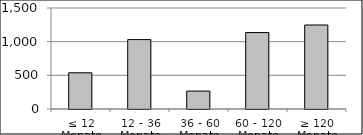
| Category | Volumen |
|---|---|
| ≤ 12 Monate | 537820639.5 |
| 12 - 36 Monate | 1030974532.33 |
| 36 - 60 Monate | 266002371.69 |
| 60 - 120 Monate | 1134982694.76 |
| ≥ 120 Monate | 1247588852.659 |